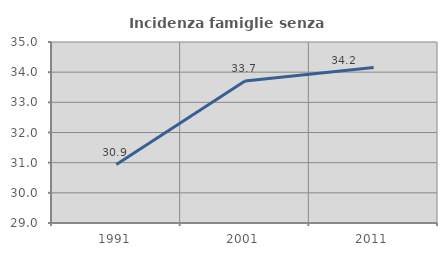
| Category | Incidenza famiglie senza nuclei |
|---|---|
| 1991.0 | 30.939 |
| 2001.0 | 33.708 |
| 2011.0 | 34.154 |